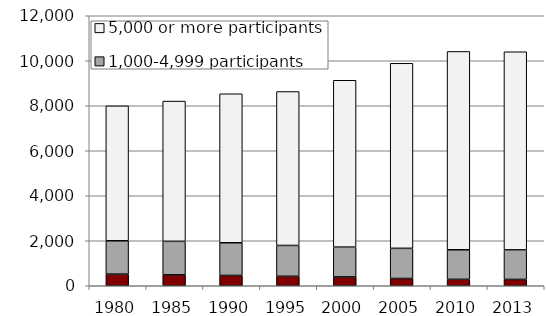
| Category | Fewer than 1,000 participants | 1,000-4,999 participants | 5,000 or more participants |
|---|---|---|---|
| 1980.0 | 517 | 1482 | 5997 |
| 1985.0 | 485 | 1490 | 6233 |
| 1990.0 | 459 | 1452 | 6622 |
| 1995.0 | 421 | 1370 | 6841 |
| 2000.0 | 393 | 1323 | 7417 |
| 2005.0 | 323 | 1340 | 8224 |
| 2010.0 | 285 | 1313 | 8816 |
| 2013.0 | 281 | 1313 | 8806 |